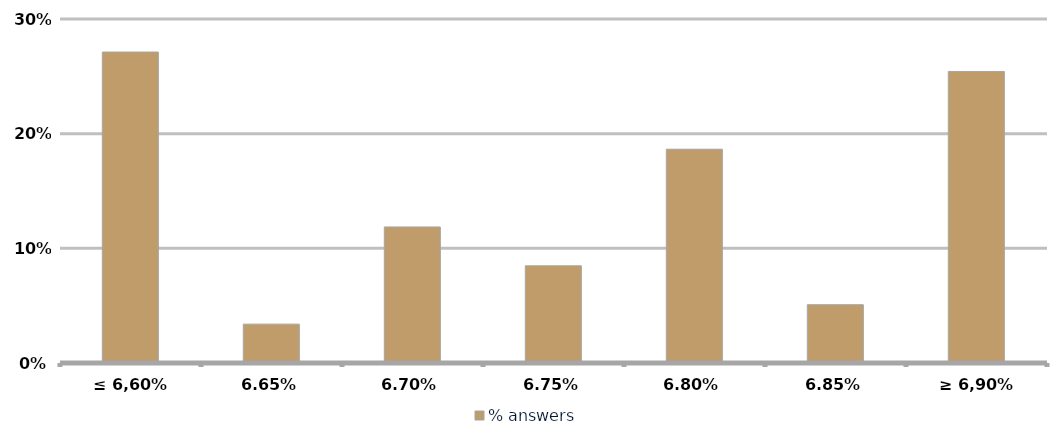
| Category | % answers |
|---|---|
| ≤ 6,60% | 0.271 |
| 6,65% | 0.034 |
| 6,70% | 0.119 |
| 6,75% | 0.085 |
| 6,80% | 0.186 |
| 6,85% | 0.051 |
| ≥ 6,90% | 0.254 |